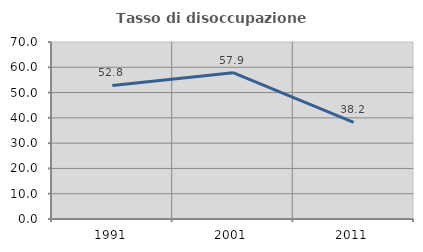
| Category | Tasso di disoccupazione giovanile  |
|---|---|
| 1991.0 | 52.818 |
| 2001.0 | 57.873 |
| 2011.0 | 38.206 |